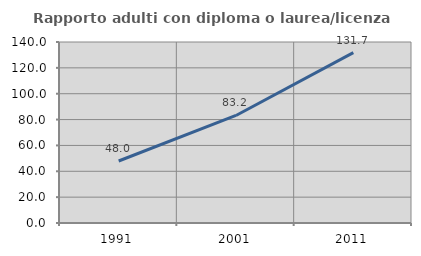
| Category | Rapporto adulti con diploma o laurea/licenza media  |
|---|---|
| 1991.0 | 47.97 |
| 2001.0 | 83.172 |
| 2011.0 | 131.726 |